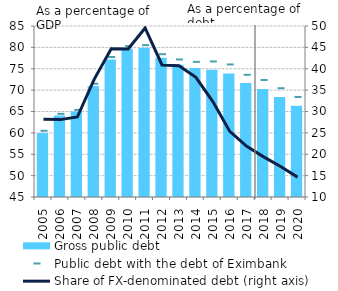
| Category | Gross public debt |
|---|---|
| 2005.0 | 59.954 |
| 2006.0 | 64.091 |
| 2007.0 | 64.979 |
| 2008.0 | 70.956 |
| 2009.0 | 77.149 |
| 2010.0 | 79.727 |
| 2011.0 | 79.913 |
| 2012.0 | 77.582 |
| 2013.0 | 75.955 |
| 2014.0 | 75.156 |
| 2015.0 | 74.741 |
| 2016.0 | 73.868 |
| 2017.0 | 71.653 |
| 2018.0 | 70.291 |
| 2019.0 | 68.368 |
| 2020.0 | 66.325 |